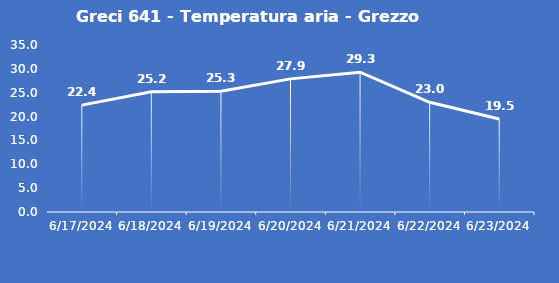
| Category | Greci 641 - Temperatura aria - Grezzo (°C) |
|---|---|
| 6/17/24 | 22.4 |
| 6/18/24 | 25.2 |
| 6/19/24 | 25.3 |
| 6/20/24 | 27.9 |
| 6/21/24 | 29.3 |
| 6/22/24 | 23 |
| 6/23/24 | 19.5 |